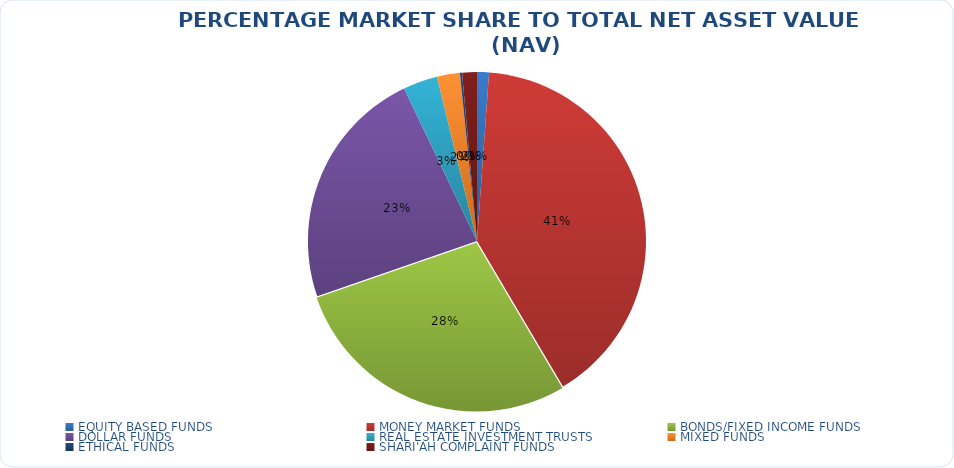
| Category | NET ASSET VALUE |
|---|---|
| EQUITY BASED FUNDS | 15846536125.77 |
| MONEY MARKET FUNDS | 560847618230.86 |
| BONDS/FIXED INCOME FUNDS | 391826846581.89 |
| DOLLAR FUNDS | 322258288651.67 |
| REAL ESTATE INVESTMENT TRUSTS | 45741836714.21 |
| MIXED FUNDS | 30447741959.92 |
| ETHICAL FUNDS | 2906435066.74 |
| SHARI'AH COMPLAINT FUNDS | 19590844185.96 |